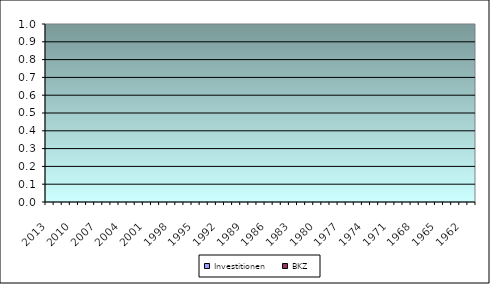
| Category | Investitionen | BKZ |
|---|---|---|
| 2013 | 0 | 0 |
| 2012 | 0 | 0 |
| 2011 | 0 | 0 |
| 2010 | 0 | 0 |
| 2009 | 0 | 0 |
| 2008 | 0 | 0 |
| 2007 | 0 | 0 |
| 2006 | 0 | 0 |
| 2005 | 0 | 0 |
| 2004 | 0 | 0 |
| 2003 | 0 | 0 |
| 2002 | 0 | 0 |
| 2001 | 0 | 0 |
| 2000 | 0 | 0 |
| 1999 | 0 | 0 |
| 1998 | 0 | 0 |
| 1997 | 0 | 0 |
| 1996 | 0 | 0 |
| 1995 | 0 | 0 |
| 1994 | 0 | 0 |
| 1993 | 0 | 0 |
| 1992 | 0 | 0 |
| 1991 | 0 | 0 |
| 1990 | 0 | 0 |
| 1989 | 0 | 0 |
| 1988 | 0 | 0 |
| 1987 | 0 | 0 |
| 1986 | 0 | 0 |
| 1985 | 0 | 0 |
| 1984 | 0 | 0 |
| 1983 | 0 | 0 |
| 1982 | 0 | 0 |
| 1981 | 0 | 0 |
| 1980 | 0 | 0 |
| 1979 | 0 | 0 |
| 1978 | 0 | 0 |
| 1977 | 0 | 0 |
| 1976 | 0 | 0 |
| 1975 | 0 | 0 |
| 1974 | 0 | 0 |
| 1973 | 0 | 0 |
| 1972 | 0 | 0 |
| 1971 | 0 | 0 |
| 1970 | 0 | 0 |
| 1969 | 0 | 0 |
| 1968 | 0 | 0 |
| 1967 | 0 | 0 |
| 1966 | 0 | 0 |
| 1965 | 0 | 0 |
| 1964 | 0 | 0 |
| 1963 | 0 | 0 |
| 1962 | 0 | 0 |
| älter | 0 | 0 |